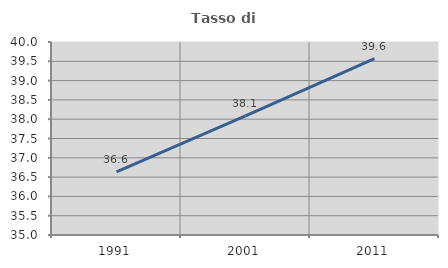
| Category | Tasso di occupazione   |
|---|---|
| 1991.0 | 36.635 |
| 2001.0 | 38.087 |
| 2011.0 | 39.571 |